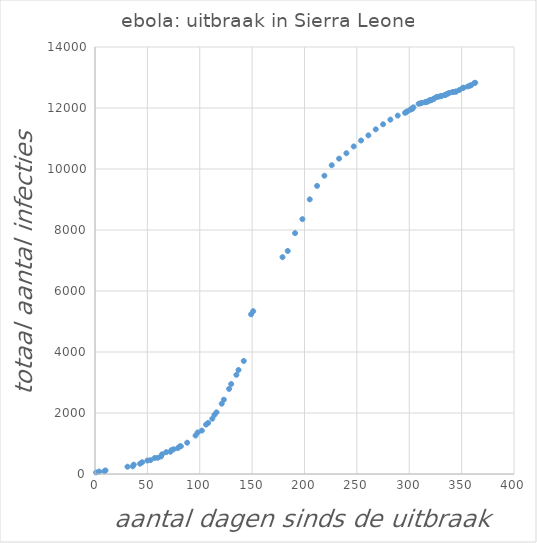
| Category | Series 0 |
|---|---|
| 1.0 | 50 |
| 4.0 | 81 |
| 9.0 | 89 |
| 10.0 | 117 |
| 31.0 | 239 |
| 36.0 | 252 |
| 37.0 | 305 |
| 43.0 | 337 |
| 45.0 | 386 |
| 50.0 | 442 |
| 53.0 | 454 |
| 57.0 | 525 |
| 60.0 | 533 |
| 63.0 | 574 |
| 64.0 | 646 |
| 68.0 | 717 |
| 72.0 | 730 |
| 73.0 | 783 |
| 75.0 | 810 |
| 79.0 | 848 |
| 81.0 | 907 |
| 82.0 | 910 |
| 88.0 | 1026 |
| 96.0 | 1261 |
| 98.0 | 1361 |
| 102.0 | 1424 |
| 106.0 | 1620 |
| 108.0 | 1673 |
| 112.0 | 1813 |
| 114.0 | 1940 |
| 116.0 | 2021 |
| 121.0 | 2304 |
| 123.0 | 2437 |
| 128.0 | 2789 |
| 130.0 | 2950 |
| 135.0 | 3252 |
| 137.0 | 3410 |
| 142.0 | 3706 |
| 149.0 | 5235 |
| 151.0 | 5338 |
| 179.0 | 7109 |
| 184.0 | 7312 |
| 191.0 | 7897 |
| 198.0 | 8356 |
| 205.0 | 9004 |
| 212.0 | 9446 |
| 219.0 | 9780 |
| 226.0 | 10124 |
| 233.0 | 10340 |
| 240.0 | 10518 |
| 247.0 | 10740 |
| 254.0 | 10934 |
| 261.0 | 11103 |
| 268.0 | 11301 |
| 275.0 | 11466 |
| 282.0 | 11619 |
| 289.0 | 11751 |
| 296.0 | 11841 |
| 297.0 | 11866 |
| 298.0 | 11889 |
| 301.0 | 11943 |
| 302.0 | 11974 |
| 303.0 | 11974 |
| 304.0 | 12022 |
| 309.0 | 12139 |
| 311.0 | 12155 |
| 312.0 | 12170 |
| 315.0 | 12188 |
| 316.0 | 12201 |
| 317.0 | 12201 |
| 318.0 | 12223 |
| 319.0 | 12244 |
| 320.0 | 12256 |
| 321.0 | 12256 |
| 321.0 | 12267 |
| 323.0 | 12294 |
| 324.0 | 12313 |
| 326.0 | 12362 |
| 328.0 | 12371 |
| 330.0 | 12387 |
| 331.0 | 12398 |
| 334.0 | 12426 |
| 335.0 | 12440 |
| 335.0 | 12440 |
| 337.0 | 12470 |
| 338.0 | 12492 |
| 341.0 | 12519 |
| 342.0 | 12523 |
| 344.0 | 12536 |
| 345.0 | 12540 |
| 348.0 | 12593 |
| 351.0 | 12656 |
| 352.0 | 12666 |
| 356.0 | 12706 |
| 358.0 | 12735 |
| 359.0 | 12745 |
| 362.0 | 12816 |
| 363.0 | 12827 |